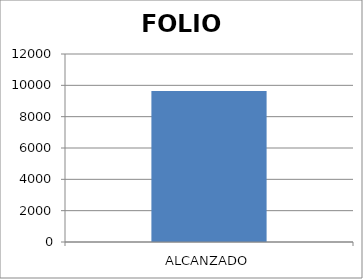
| Category | FOLIO |
|---|---|
| ALCANZADO | 9646 |